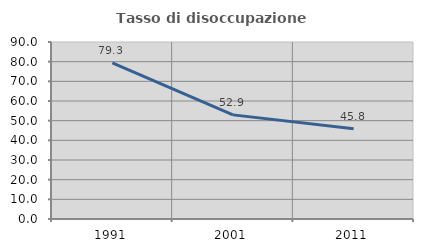
| Category | Tasso di disoccupazione giovanile  |
|---|---|
| 1991.0 | 79.348 |
| 2001.0 | 52.941 |
| 2011.0 | 45.833 |